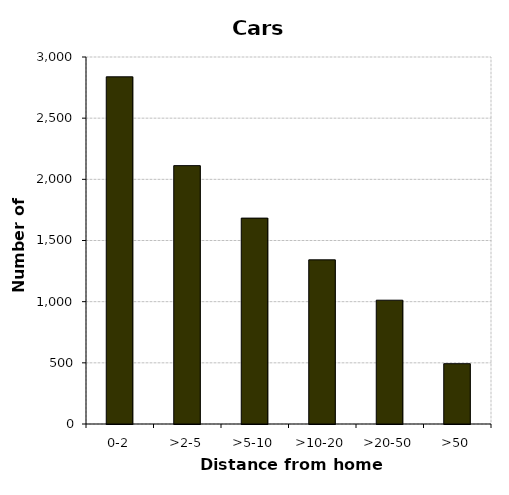
| Category | Cars |
|---|---|
| 0-2 | 2838 |
| >2-5 | 2112 |
| >5-10 | 1683 |
| >10-20 | 1342 |
| >20-50 | 1012 |
| >50 | 493 |